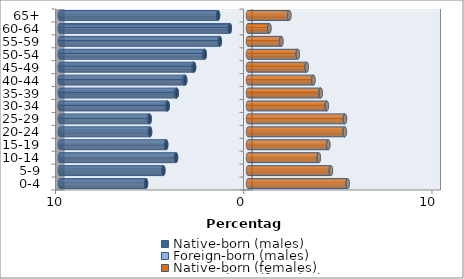
| Category | Native-born (males) | Foreign-born (males) | Native-born (females) | Foreign-born (females) |
|---|---|---|---|---|
| 0-4 | -5.416 | -0.009 | 5.288 | 0.008 |
| 5-9 | -4.494 | -0.009 | 4.397 | 0.008 |
| 10-14 | -3.822 | -0.008 | 3.756 | 0.007 |
| 15-19 | -4.345 | -0.011 | 4.258 | 0.008 |
| 20-24 | -5.202 | -0.033 | 5.131 | 0.018 |
| 25-29 | -5.221 | -0.048 | 5.139 | 0.018 |
| 30-34 | -4.264 | -0.052 | 4.175 | 0.015 |
| 35-39 | -3.784 | -0.065 | 3.854 | 0.015 |
| 40-44 | -3.336 | -0.071 | 3.463 | 0.016 |
| 45-49 | -2.864 | -0.06 | 3.111 | 0.015 |
| 50-54 | -2.297 | -0.037 | 2.636 | 0.011 |
| 55-59 | -1.495 | -0.022 | 1.767 | 0.009 |
| 60-64 | -0.967 | -0.01 | 1.132 | 0.006 |
| 65+ | -1.591 | -0.009 | 2.189 | 0.009 |